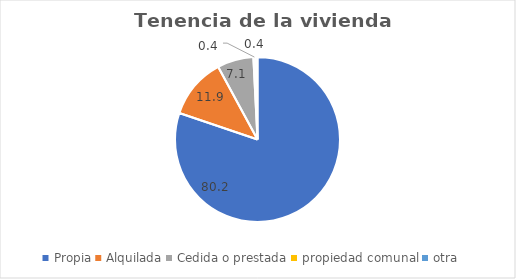
| Category | % |
|---|---|
| Propia | 80.2 |
| Alquilada | 11.9 |
| Cedida o prestada | 7.1 |
| propiedad comunal | 0.4 |
| otra | 0.4 |